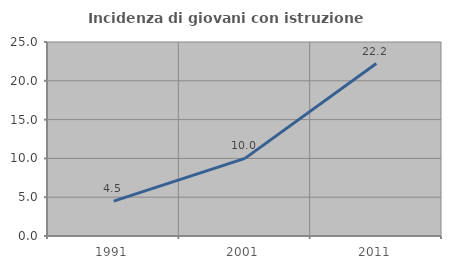
| Category | Incidenza di giovani con istruzione universitaria |
|---|---|
| 1991.0 | 4.494 |
| 2001.0 | 10 |
| 2011.0 | 22.222 |